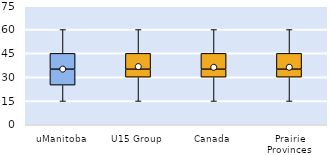
| Category | 25th | 50th | 75th |
|---|---|---|---|
| uManitoba | 25 | 10 | 10 |
| U15 Group | 30 | 5 | 10 |
| Canada | 30 | 5 | 10 |
| Prairie Provinces | 30 | 5 | 10 |